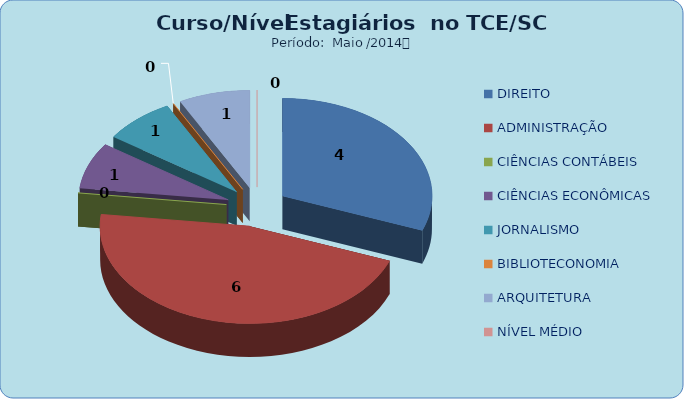
| Category | Series 0 |
|---|---|
| DIREITO | 4 |
| ADMINISTRAÇÃO | 6 |
| CIÊNCIAS CONTÁBEIS | 0 |
| CIÊNCIAS ECONÔMICAS | 1 |
| JORNALISMO | 1 |
| BIBLIOTECONOMIA | 0 |
| ARQUITETURA | 1 |
| NÍVEL MÉDIO | 0 |